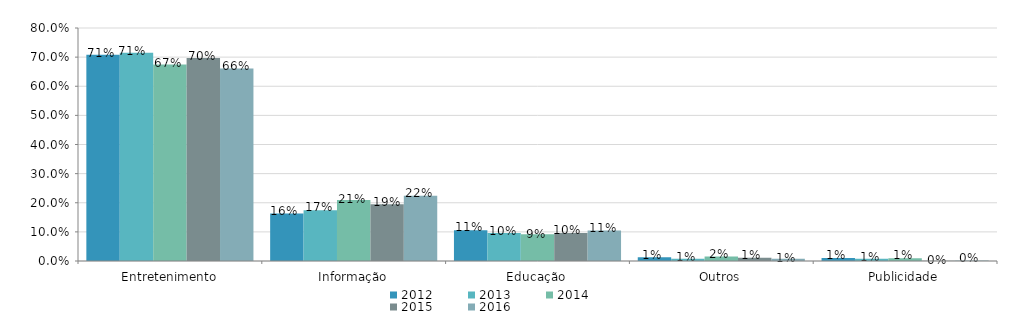
| Category | 2012 | 2013 | 2014 | 2015 | 2016 |
|---|---|---|---|---|---|
| Entretenimento | 0.708 | 0.715 | 0.674 | 0.697 | 0.661 |
| Informação | 0.163 | 0.174 | 0.21 | 0.195 | 0.224 |
| Educação | 0.106 | 0.096 | 0.092 | 0.096 | 0.105 |
| Outros | 0.013 | 0.008 | 0.015 | 0.011 | 0.008 |
| Publicidade | 0.01 | 0.007 | 0.009 | 0.001 | 0.002 |